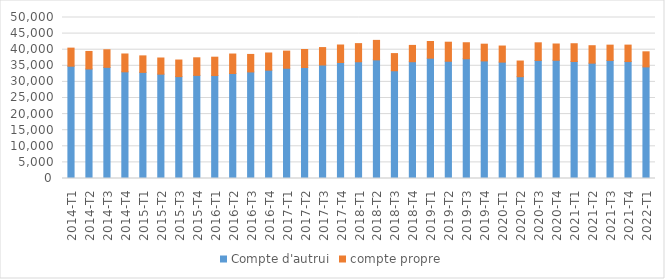
| Category | Compte d'autrui | compte propre |
|---|---|---|
| 2014-T1 | 34876.978 | 5615.98 |
| 2014-T2 | 34014.136 | 5441.442 |
| 2014-T3 | 34518.495 | 5461.37 |
| 2014-T4 | 33130.585 | 5538.904 |
| 2015-T1 | 32955.688 | 5125.567 |
| 2015-T2 | 32407.222 | 5015.218 |
| 2015-T3 | 31639.656 | 5154.042 |
| 2015-T4 | 32023.203 | 5459.982 |
| 2016-T1 | 31972.289 | 5701.926 |
| 2016-T2 | 32615.855 | 6041.464 |
| 2016-T3 | 33093.677 | 5437.558 |
| 2016-T4 | 33640.932 | 5336.077 |
| 2017-T1 | 34243.163 | 5314.68 |
| 2017-T2 | 34464.765 | 5601.161 |
| 2017-T3 | 35246.41 | 5414.055 |
| 2017-T4 | 36022.592 | 5435.31 |
| 2018-T1 | 36249.948 | 5638.308 |
| 2018-T2 | 36842.981 | 6051.843 |
| 2018-T3 | 33461.545 | 5329.606 |
| 2018-T4 | 36266.943 | 5066.637 |
| 2019-T1 | 37365.823 | 5184.481 |
| 2019-T2 | 36414.188 | 5914.055 |
| 2019-T3 | 37188.471 | 4971.53 |
| 2019-T4 | 36518.454 | 5195.864 |
| 2020-T1 | 36138.217 | 5002.433 |
| 2020-T2 | 31611.708 | 4869.801 |
| 2020-T3 | 36669.793 | 5468.416 |
| 2020-T4 | 36714.422 | 5055.605 |
| 2021-T1 | 36329.789 | 5523.455 |
| 2021-T2 | 35816.739 | 5422.896 |
| 2021-T3 | 36671.982 | 4742.993 |
| 2021-T4 | 36317.561 | 5107.682 |
| 2022-T1 | 34661.62 | 4681.509 |